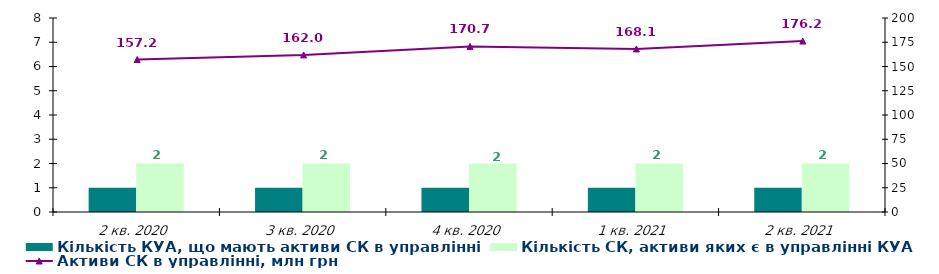
| Category | Кількість КУА, що мають активи СК в управлінні | Кількість СК, активи яких є в управлінні КУА |
|---|---|---|
| 2 кв. 2020 | 1 | 2 |
| 3 кв. 2020 | 1 | 2 |
| 4 кв. 2020 | 1 | 2 |
| 1 кв. 2021 | 1 | 2 |
| 2 кв. 2021 | 1 | 2 |